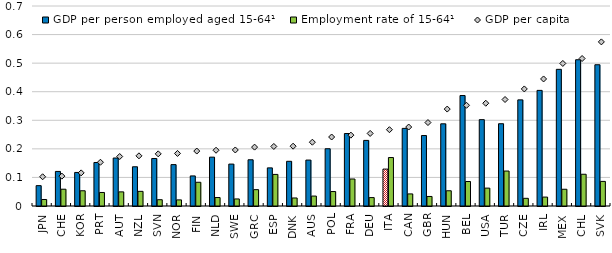
| Category | GDP per person employed aged 15-64¹ | Employment rate of 15-64¹ |
|---|---|---|
| JPN | 0.071 | 0.023 |
| CHE | 0.121 | 0.059 |
| KOR | 0.117 | 0.053 |
| PRT | 0.152 | 0.047 |
| AUT | 0.168 | 0.049 |
| NZL | 0.137 | 0.051 |
| SVN | 0.166 | 0.022 |
| NOR | 0.145 | 0.021 |
| FIN | 0.105 | 0.083 |
| NLD | 0.171 | 0.03 |
| SWE | 0.147 | 0.025 |
| GRC | 0.162 | 0.057 |
| ESP | 0.133 | 0.111 |
| DNK | 0.156 | 0.028 |
| AUS | 0.161 | 0.035 |
| POL | 0.2 | 0.051 |
| FRA | 0.254 | 0.095 |
| DEU | 0.23 | 0.029 |
| ITA | 0.129 | 0.17 |
| CAN | 0.272 | 0.042 |
| GBR | 0.247 | 0.033 |
| HUN | 0.288 | 0.053 |
| BEL | 0.387 | 0.086 |
| USA | 0.302 | 0.063 |
| TUR | 0.288 | 0.122 |
| CZE | 0.371 | 0.027 |
| IRL | 0.405 | 0.031 |
| MEX | 0.478 | 0.059 |
| CHL | 0.512 | 0.111 |
| SVK | 0.494 | 0.086 |